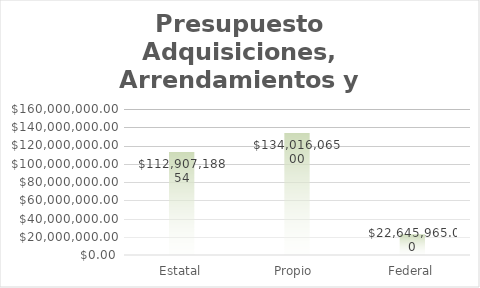
| Category | Series 0 |
|---|---|
| Estatal | 112907188.54 |
| Propio  | 134016065 |
| Federal | 22645965 |